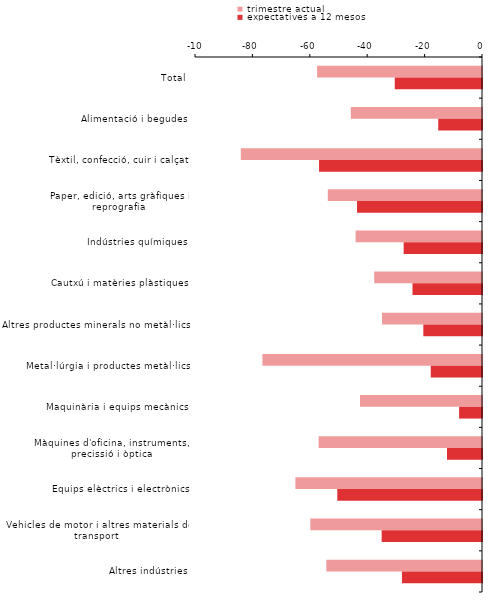
| Category | trimestre actual | expectatives a 12 mesos |
|---|---|---|
| Total | -57.457 | -30.39 |
| Alimentació i begudes | -45.716 | -15.243 |
| Tèxtil, confecció, cuir i calçat | -84.036 | -56.78 |
| Paper, edició, arts gràfiques i reprografia | -53.735 | -43.548 |
| Indústries químiques | -44.036 | -27.303 |
| Cautxú i matèries plàstiques | -37.558 | -24.221 |
| Altres productes minerals no metàl·lics | -34.826 | -20.443 |
| Metal·lúrgia i productes metàl·lics | -76.5 | -17.855 |
| Maquinària i equips mecànics | -42.506 | -7.976 |
| Màquines d'oficina, instruments, precissió i òptica | -56.934 | -12.196 |
| Equips elèctrics i electrònics | -65.023 | -50.42 |
| Vehicles de motor i altres materials de transport | -59.817 | -34.961 |
| Altres indústries | -54.242 | -27.886 |